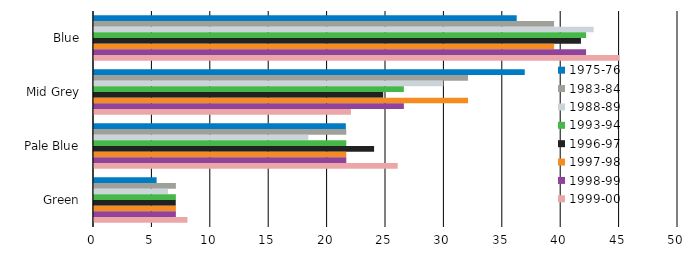
| Category | 1975-76 | 1983-84 | 1988-89 | 1993-94 | 1996-97 | 1997-98 | 1998-99 | 1999-00 |
|---|---|---|---|---|---|---|---|---|
| Blue | 36.19 | 39.39 | 42.78 | 42.13 | 41.69 | 39.39 | 42.13 | 45 |
| Mid Grey | 36.88 | 32.02 | 29.91 | 26.53 | 24.76 | 32.02 | 26.53 | 22 |
| Pale Blue | 21.56 | 21.6 | 18.35 | 21.6 | 23.98 | 21.6 | 21.6 | 26 |
| Green | 5.36 | 7.01 | 6.33 | 7.01 | 7 | 7.01 | 7.01 | 8 |